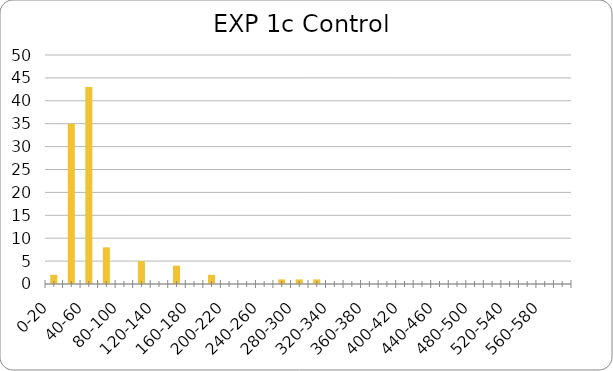
| Category | Series 0 |
|---|---|
| 0-20 | 2 |
| 20-40 | 35 |
| 40-60 | 43 |
| 60-80 | 8 |
| 80-100 | 0 |
| 100-120 | 5 |
| 120-140 | 0 |
| 140-160 | 4 |
| 160-180 | 0 |
| 180-200 | 2 |
| 200-220 | 0 |
| 220-240 | 0 |
| 240-260 | 0 |
| 260-280 | 1 |
| 280-300 | 1 |
| 300-320 | 1 |
| 320-340 | 0 |
| 340-360 | 0 |
| 360-380 | 0 |
| 380-400 | 0 |
| 400-420 | 0 |
| 420-440 | 0 |
| 440-460 | 0 |
| 460-480 | 0 |
| 480-500 | 0 |
| 500-520 | 0 |
| 520-540 | 0 |
| 540-560 | 0 |
| 560-580 | 0 |
| 580-600 | 0 |